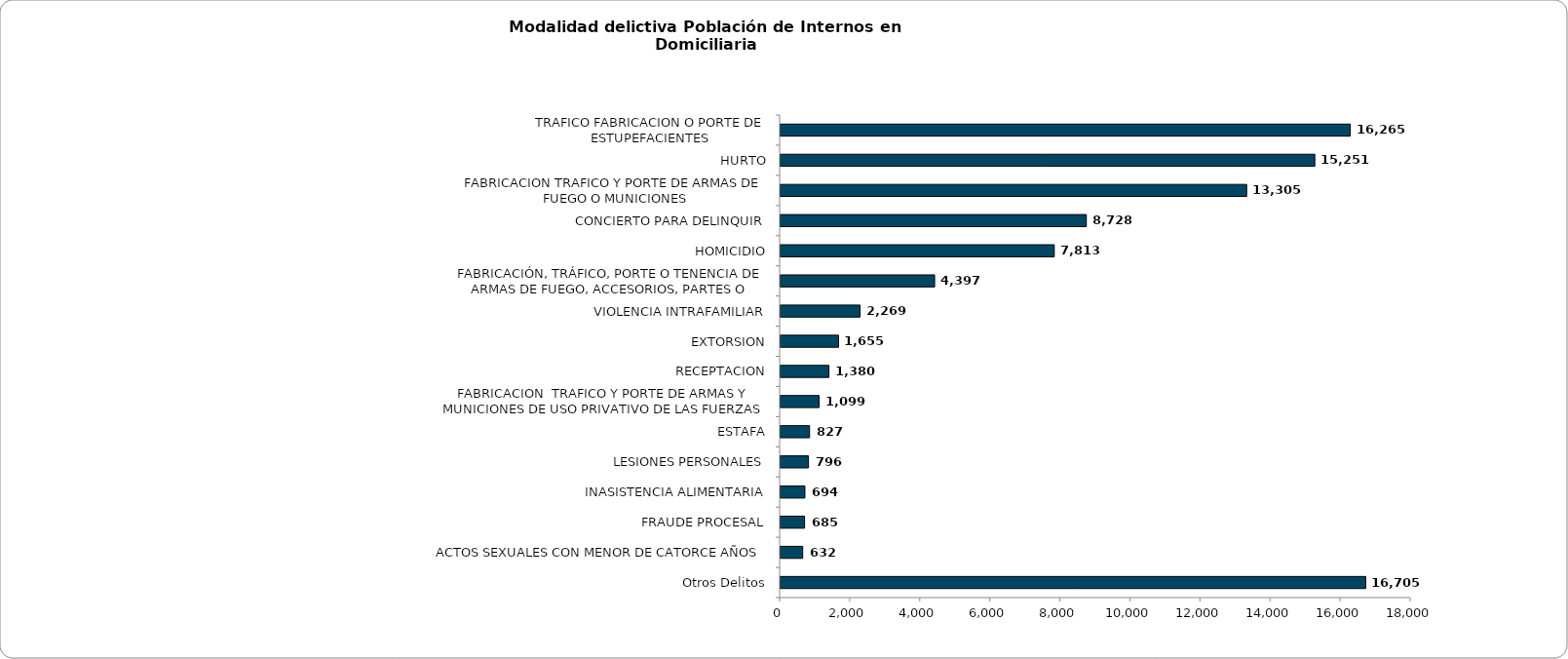
| Category | Series 0 |
|---|---|
| TRAFICO FABRICACION O PORTE DE ESTUPEFACIENTES | 16265 |
| HURTO | 15251 |
| FABRICACION TRAFICO Y PORTE DE ARMAS DE FUEGO O MUNICIONES | 13305 |
| CONCIERTO PARA DELINQUIR | 8728 |
| HOMICIDIO | 7813 |
| FABRICACIÓN, TRÁFICO, PORTE O TENENCIA DE ARMAS DE FUEGO, ACCESORIOS, PARTES O MUNICIONES | 4397 |
| VIOLENCIA INTRAFAMILIAR | 2269 |
| EXTORSION | 1655 |
| RECEPTACION | 1380 |
| FABRICACION  TRAFICO Y PORTE DE ARMAS Y MUNICIONES DE USO PRIVATIVO DE LAS FUERZAS ARMADAS | 1099 |
| ESTAFA | 827 |
| LESIONES PERSONALES | 796 |
| INASISTENCIA ALIMENTARIA | 694 |
| FRAUDE PROCESAL | 685 |
| ACTOS SEXUALES CON MENOR DE CATORCE AÑOS | 632 |
| Otros Delitos | 16705 |